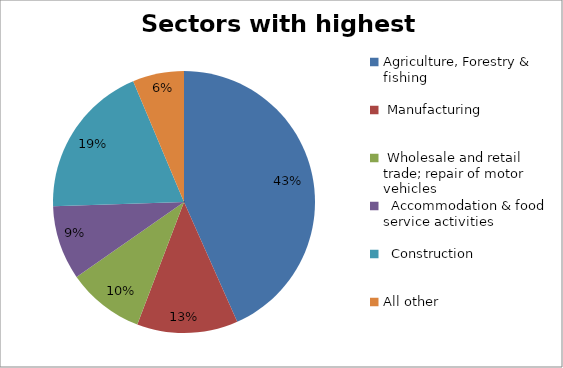
| Category | Sectors with highest totals | Percentage |
|---|---|---|
| Agriculture, Forestry & fishing | 20247 | 0.433 |
|  Manufacturing | 5823 | 0.125 |
|  Wholesale and retail trade; repair of motor vehicles  | 4444 | 0.095 |
|   Accommodation & food service activities | 4277 | 0.092 |
|   Construction | 8964 | 0.192 |
| All other | 2962 | 0.063 |